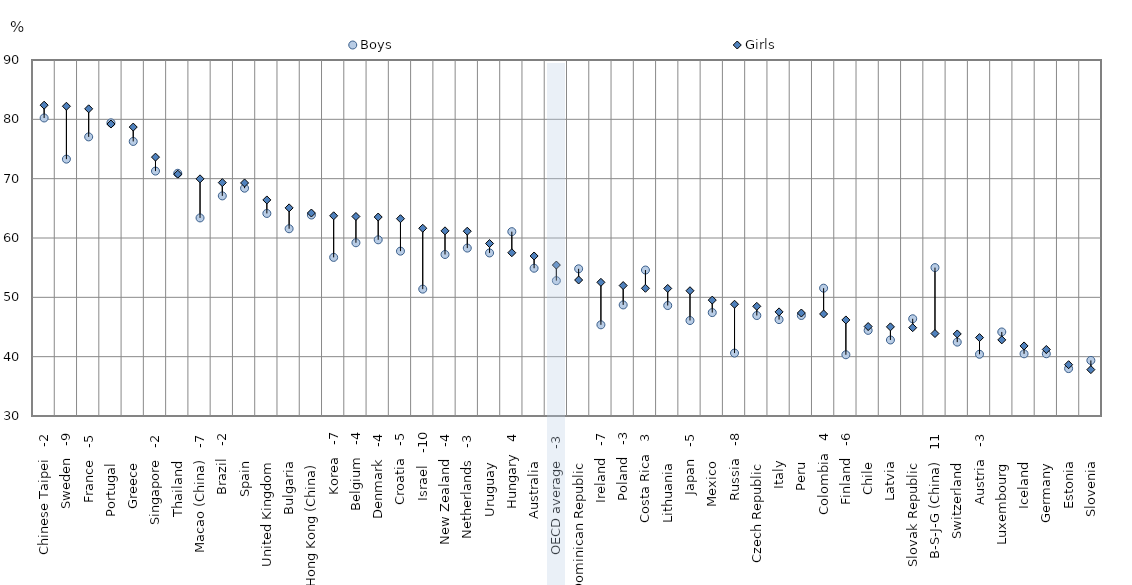
| Category | Boys | Girls |
|---|---|---|
| Chinese Taipei   -2 | 80.229 | 82.384 |
| Sweden   -9 | 73.291 | 82.205 |
| France   -5 | 77.041 | 81.772 |
| Portugal        | 79.411 | 79.206 |
| Greece        | 76.272 | 78.698 |
| Singapore   -2 | 71.279 | 73.632 |
| Thailand        | 70.906 | 70.761 |
| Macao (China)   -7 | 63.384 | 69.972 |
| Brazil   -2 | 67.099 | 69.335 |
| Spain        | 68.395 | 69.275 |
| United Kingdom        | 64.139 | 66.415 |
| Bulgaria        | 61.559 | 65.078 |
| Hong Kong (China)        | 63.87 | 64.209 |
| Korea   -7 | 56.732 | 63.742 |
| Belgium   -4 | 59.198 | 63.625 |
| Denmark   -4 | 59.695 | 63.533 |
| Croatia   -5 | 57.783 | 63.251 |
| Israel   -10 | 51.385 | 61.643 |
| New Zealand   -4 | 57.221 | 61.208 |
| Netherlands   -3 | 58.3 | 61.145 |
| Uruguay        | 57.48 | 59.07 |
| Hungary   4 | 61.071 | 57.518 |
| Australia        | 54.906 | 56.966 |
| OECD average   -3 | 52.811 | 55.441 |
| Dominican Republic        | 54.807 | 52.919 |
| Ireland   -7 | 45.366 | 52.526 |
| Poland   -3 | 48.718 | 51.985 |
| Costa Rica   3 | 54.6 | 51.524 |
| Lithuania        | 48.618 | 51.494 |
| Japan   -5 | 46.093 | 51.114 |
| Mexico        | 47.429 | 49.532 |
| Russia   -8 | 40.605 | 48.834 |
| Czech Republic        | 46.934 | 48.483 |
| Italy        | 46.246 | 47.548 |
| Peru        | 46.939 | 47.357 |
| Colombia   4 | 51.543 | 47.197 |
| Finland   -6 | 40.321 | 46.191 |
| Chile        | 44.431 | 45.077 |
| Latvia        | 42.814 | 45.025 |
| Slovak Republic        | 46.389 | 44.885 |
| B-S-J-G (China)   11 | 55.012 | 43.899 |
| Switzerland        | 42.451 | 43.829 |
| Austria   -3 | 40.403 | 43.212 |
| Luxembourg        | 44.164 | 42.83 |
| Iceland        | 40.479 | 41.81 |
| Germany        | 40.493 | 41.215 |
| Estonia        | 37.992 | 38.646 |
| Slovenia        | 39.364 | 37.816 |